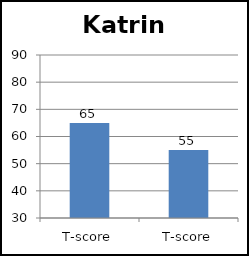
| Category | Katrina |
|---|---|
| T-score | 65 |
| T-score | 55 |